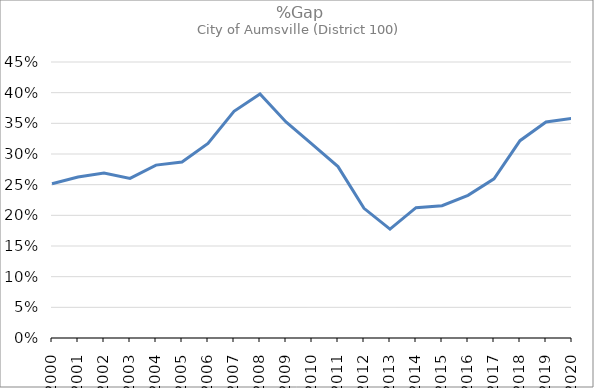
| Category | Series 0 |
|---|---|
| 2000.0 | 0.252 |
| 2001.0 | 0.263 |
| 2002.0 | 0.269 |
| 2003.0 | 0.26 |
| 2004.0 | 0.282 |
| 2005.0 | 0.287 |
| 2006.0 | 0.317 |
| 2007.0 | 0.37 |
| 2008.0 | 0.398 |
| 2009.0 | 0.352 |
| 2010.0 | 0.316 |
| 2011.0 | 0.279 |
| 2012.0 | 0.211 |
| 2013.0 | 0.177 |
| 2014.0 | 0.213 |
| 2015.0 | 0.216 |
| 2016.0 | 0.233 |
| 2017.0 | 0.26 |
| 2018.0 | 0.322 |
| 2019.0 | 0.352 |
| 2020.0 | 0.358 |